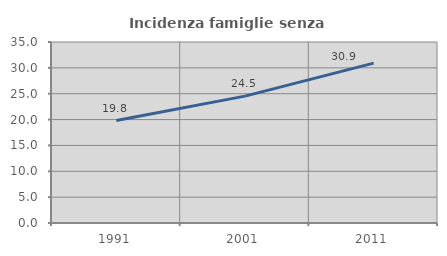
| Category | Incidenza famiglie senza nuclei |
|---|---|
| 1991.0 | 19.814 |
| 2001.0 | 24.538 |
| 2011.0 | 30.911 |